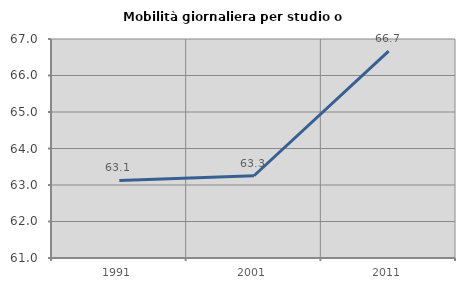
| Category | Mobilità giornaliera per studio o lavoro |
|---|---|
| 1991.0 | 63.125 |
| 2001.0 | 63.253 |
| 2011.0 | 66.67 |